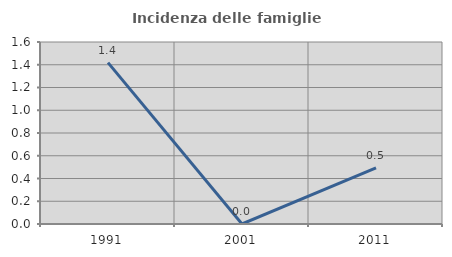
| Category | Incidenza delle famiglie numerose |
|---|---|
| 1991.0 | 1.418 |
| 2001.0 | 0 |
| 2011.0 | 0.493 |